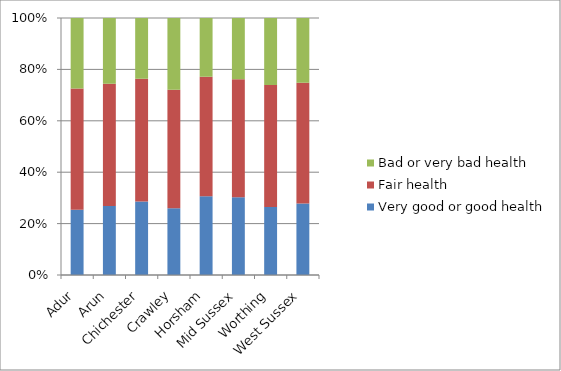
| Category | Very good or good health | Fair health | Bad or very bad health |
|---|---|---|---|
| Adur  | 3122 | 5811 | 3369 |
| Arun | 8460 | 14965 | 8064 |
| Chichester | 5691 | 9492 | 4700 |
| Crawley | 4082 | 7230 | 4390 |
| Horsham | 5953 | 9018 | 4436 |
| Mid Sussex | 5994 | 9106 | 4721 |
| Worthing | 5360 | 9636 | 5280 |
| West Sussex | 38662 | 65258 | 34960 |